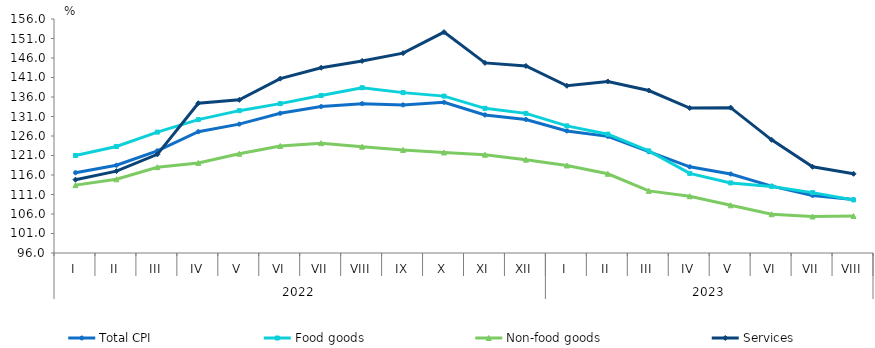
| Category | Total CPI | Food goods | Non-food goods | Services |
|---|---|---|---|---|
| 0 | 116.6 | 121 | 113.4 | 114.8 |
| 1 | 118.5 | 123.3 | 114.9 | 117 |
| 2 | 122.2 | 127 | 118 | 121.3 |
| 3 | 127.1 | 130.2 | 119.1 | 134.4 |
| 4 | 129.047 | 132.5 | 121.45 | 135.267 |
| 5 | 131.827 | 134.301 | 123.443 | 140.701 |
| 6 | 133.547 | 136.399 | 124.168 | 143.511 |
| 7 | 134.294 | 138.387 | 123.256 | 145.253 |
| 8 | 133.971 | 137.121 | 122.424 | 147.248 |
| 9 | 134.625 | 136.226 | 121.779 | 152.646 |
| 10 | 131.406 | 133.093 | 121.201 | 144.742 |
| 11 | 130.241 | 131.801 | 119.936 | 143.965 |
| 12 | 127.307 | 128.59 | 118.441 | 138.865 |
| 13 | 125.905 | 126.472 | 116.307 | 139.99 |
| 14 | 121.977 | 122.19 | 111.932 | 137.666 |
| 15 | 118.102 | 116.414 | 110.554 | 133.178 |
| 16 | 116.262 | 113.97 | 108.228 | 133.268 |
| 17 | 113.152 | 113.076 | 105.931 | 125.017 |
| 18 | 110.755 | 111.48 | 105.365 | 118.101 |
| 19 | 109.689 | 109.605 | 105.486 | 116.313 |